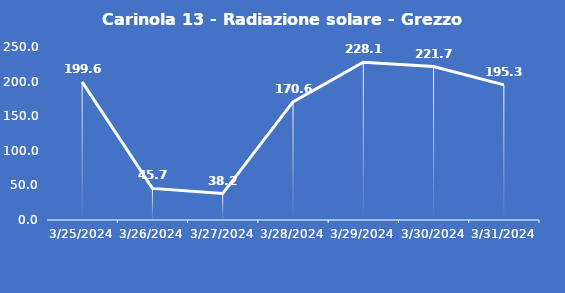
| Category | Carinola 13 - Radiazione solare - Grezzo (W/m2) |
|---|---|
| 3/25/24 | 199.6 |
| 3/26/24 | 45.7 |
| 3/27/24 | 38.2 |
| 3/28/24 | 170.6 |
| 3/29/24 | 228.1 |
| 3/30/24 | 221.7 |
| 3/31/24 | 195.3 |